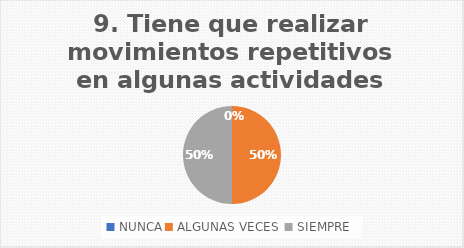
| Category | Tiene que realizar movimientos repetitivos en algunas actividades diarias? |
|---|---|
| NUNCA | 0 |
| ALGUNAS VECES  | 50 |
| SIEMPRE | 50 |